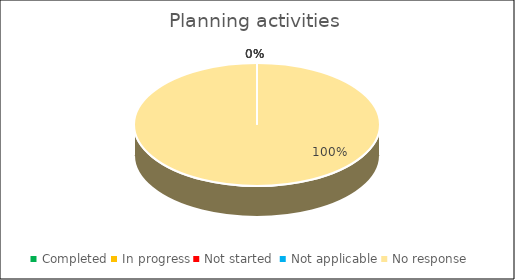
| Category | Series 0 |
|---|---|
| Completed | 0 |
| In progress | 0 |
| Not started  | 0 |
| Not applicable | 0 |
| No response | 1 |